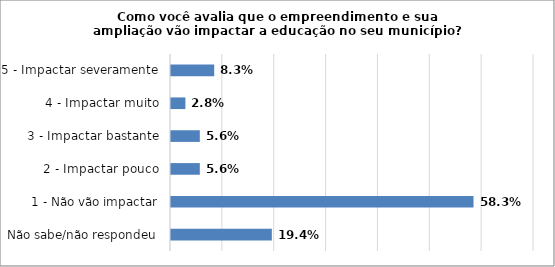
| Category | Series 0 |
|---|---|
| Não sabe/não respondeu | 0.194 |
| 1 - Não vão impactar | 0.583 |
| 2 - Impactar pouco | 0.056 |
| 3 - Impactar bastante | 0.056 |
| 4 - Impactar muito | 0.028 |
| 5 - Impactar severamente | 0.083 |